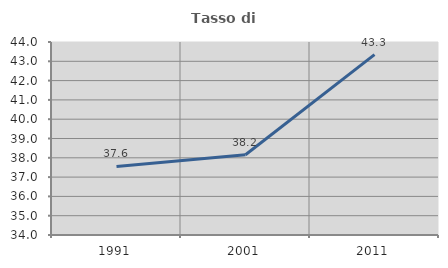
| Category | Tasso di occupazione   |
|---|---|
| 1991.0 | 37.552 |
| 2001.0 | 38.157 |
| 2011.0 | 43.344 |